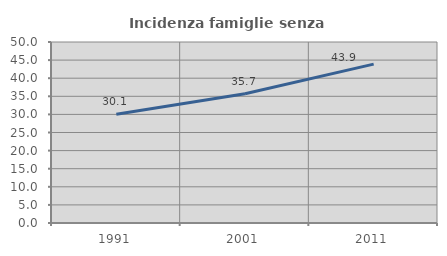
| Category | Incidenza famiglie senza nuclei |
|---|---|
| 1991.0 | 30.054 |
| 2001.0 | 35.691 |
| 2011.0 | 43.894 |